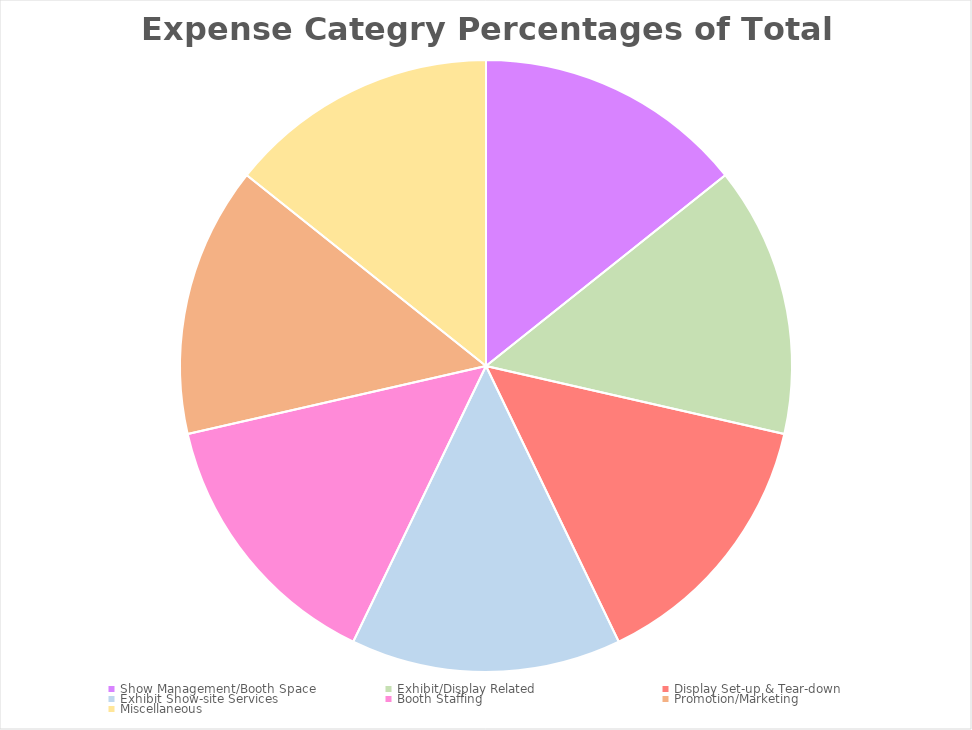
| Category | Series 0 |
|---|---|
| Show Management/Booth Space | 600 |
| Exhibit/Display Related | 600 |
| Display Set-up & Tear-down  | 600 |
| Exhibit Show-site Services | 600 |
| Booth Staffing | 600 |
| Promotion/Marketing | 600 |
| Miscellaneous | 600 |